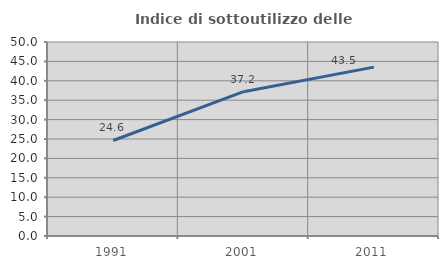
| Category | Indice di sottoutilizzo delle abitazioni  |
|---|---|
| 1991.0 | 24.619 |
| 2001.0 | 37.192 |
| 2011.0 | 43.519 |